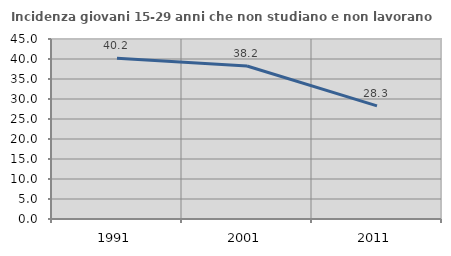
| Category | Incidenza giovani 15-29 anni che non studiano e non lavorano  |
|---|---|
| 1991.0 | 40.179 |
| 2001.0 | 38.238 |
| 2011.0 | 28.283 |